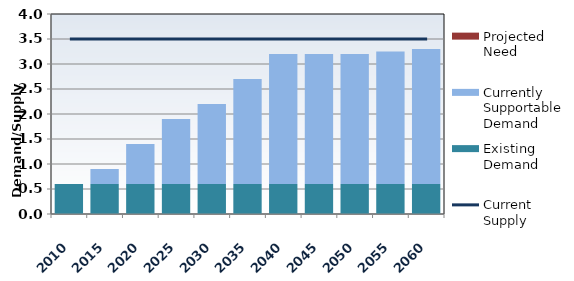
| Category | Existing Demand | Currently Supportable Demand | Projected Need |
|---|---|---|---|
| 2010.0 | 0.6 | 0 | 0 |
| 2015.0 | 0.6 | 0.3 | 0 |
| 2020.0 | 0.6 | 0.8 | 0 |
| 2025.0 | 0.6 | 1.3 | 0 |
| 2030.0 | 0.6 | 1.6 | 0 |
| 2035.0 | 0.6 | 2.1 | 0 |
| 2040.0 | 0.6 | 2.6 | 0 |
| 2045.0 | 0.6 | 2.6 | 0 |
| 2050.0 | 0.6 | 2.6 | 0 |
| 2055.0 | 0.6 | 2.65 | 0 |
| 2060.0 | 0.6 | 2.7 | 0 |